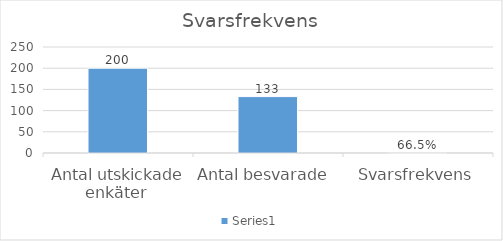
| Category | Series 0 |
|---|---|
| Antal utskickade enkäter  | 200 |
| Antal besvarade  | 133 |
| Svarsfrekvens | 0.665 |